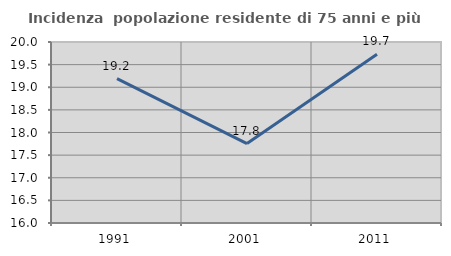
| Category | Incidenza  popolazione residente di 75 anni e più |
|---|---|
| 1991.0 | 19.189 |
| 2001.0 | 17.755 |
| 2011.0 | 19.73 |